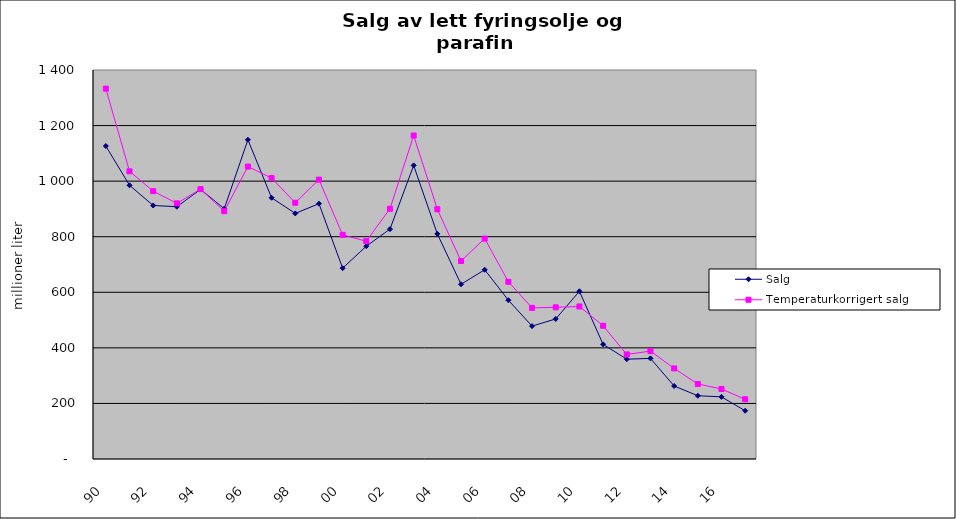
| Category | Salg | Temperaturkorrigert salg |
|---|---|---|
| 90 | 1126.42 | 1332.895 |
| 91 | 985.093 | 1035.369 |
| 92 | 912.343 | 963.982 |
| 93 | 907.947 | 920.049 |
| 94 | 970.426 | 971.364 |
| 95 | 900.86 | 891.833 |
| 96 | 1148.965 | 1052.457 |
| 97 | 940.123 | 1011.175 |
| 98 | 883.839 | 922.212 |
| 99 | 918.909 | 1005.505 |
| 00 | 686.735 | 806.63 |
| 01 | 765.933 | 783.854 |
| 02 | 827.284 | 900.587 |
| 03 | 1056.639 | 1164.26 |
| 04 | 810.166 | 898.803 |
| 05 | 628.864 | 712.529 |
| 06 | 681.082 | 793.272 |
| 07 | 571.511 | 637.876 |
| 08 | 478.315 | 543.939 |
| 09 | 504.045 | 545.88 |
| 10 | 603.569 | 548.886 |
| 11 | 412.698 | 479.514 |
| 12 | 359.093 | 376.222 |
| 13 | 362.105 | 388.357 |
| 14 | 262.821 | 326.076 |
| 15 | 227.668 | 270.06 |
| 16 | 223.613 | 252.012 |
| 17 | 173.606 | 214.925 |